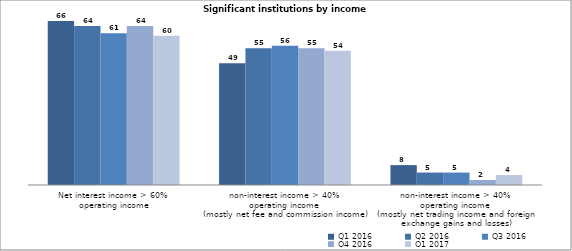
| Category | Q1 2016 | Q2 2016 | Q3 2016 | Q4 2016 | Q1 2017 |
|---|---|---|---|---|---|
| Net interest income > 60% 
operating income | 66 | 64 | 61 | 64 | 60 |
| non-interest income > 40% 
operating income 
(mostly net fee and commission income) | 49 | 55 | 56 | 55 | 54 |
| non-interest income > 40% 
operating income 
(mostly net trading income and foreign exchange gains and losses) | 8 | 5 | 5 | 2 | 4 |